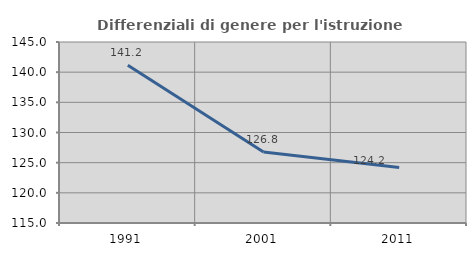
| Category | Differenziali di genere per l'istruzione superiore |
|---|---|
| 1991.0 | 141.155 |
| 2001.0 | 126.765 |
| 2011.0 | 124.19 |